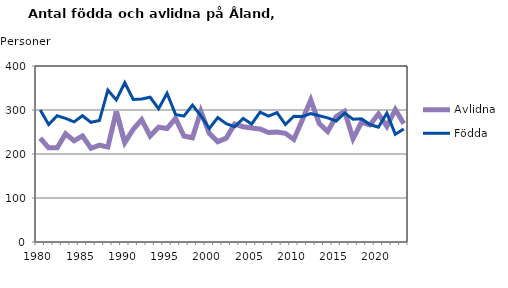
| Category | Avlidna | Födda |
|---|---|---|
| 1980.0 | 236 | 300 |
| 1981.0 | 214 | 267 |
| 1982.0 | 214 | 287 |
| 1983.0 | 246 | 281 |
| 1984.0 | 230 | 273 |
| 1985.0 | 241 | 287 |
| 1986.0 | 213 | 272 |
| 1987.0 | 220 | 276 |
| 1988.0 | 216 | 345 |
| 1989.0 | 297 | 323 |
| 1990.0 | 226 | 362 |
| 1991.0 | 256 | 324 |
| 1992.0 | 278 | 325 |
| 1993.0 | 241 | 329 |
| 1994.0 | 261 | 303 |
| 1995.0 | 258 | 338 |
| 1996.0 | 281 | 290 |
| 1997.0 | 241 | 286 |
| 1998.0 | 237 | 311 |
| 1999.0 | 297 | 287 |
| 2000.0 | 247 | 258 |
| 2001.0 | 228 | 283 |
| 2002.0 | 236 | 269 |
| 2003.0 | 268 | 262 |
| 2004.0 | 262 | 281 |
| 2005.0 | 259 | 268 |
| 2006.0 | 257 | 295 |
| 2007.0 | 249 | 286 |
| 2008.0 | 250 | 294 |
| 2009.0 | 247 | 267 |
| 2010.0 | 233 | 286 |
| 2011.0 | 277 | 285 |
| 2012.0 | 323 | 292 |
| 2013.0 | 269 | 287 |
| 2014.0 | 251 | 282 |
| 2015.0 | 285 | 275 |
| 2016.0 | 297 | 293 |
| 2017.0 | 235 | 279 |
| 2018.0 | 272 | 280 |
| 2019.0 | 266 | 267 |
| 2020.0 | 291 | 261 |
| 2021.0 | 263 | 293 |
| 2022.0 | 301 | 245 |
| 2023.0 | 269 | 257 |